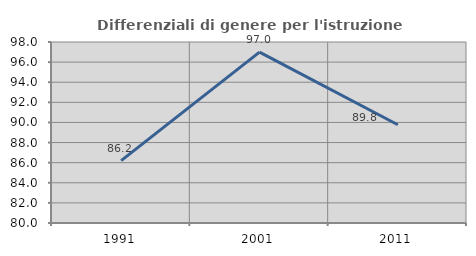
| Category | Differenziali di genere per l'istruzione superiore |
|---|---|
| 1991.0 | 86.2 |
| 2001.0 | 96.997 |
| 2011.0 | 89.775 |